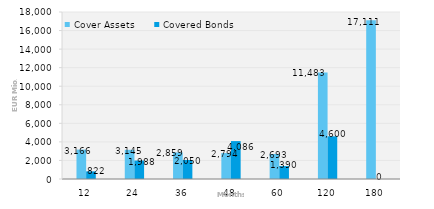
| Category | Cover Assets | Covered Bonds |
|---|---|---|
| 12.0 | 3165.955 | 821.844 |
| 24.0 | 3144.831 | 1988 |
| 36.0 | 2858.941 | 2050 |
| 48.0 | 2793.808 | 4086.41 |
| 60.0 | 2693.396 | 1390 |
| 120.0 | 11483.471 | 4600 |
| 180.0 | 17110.558 | 0 |